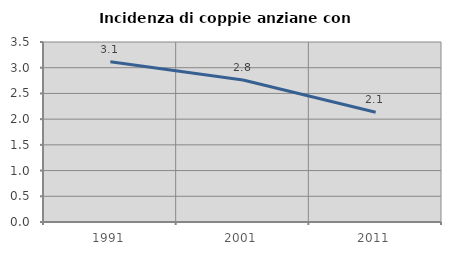
| Category | Incidenza di coppie anziane con figli |
|---|---|
| 1991.0 | 3.116 |
| 2001.0 | 2.762 |
| 2011.0 | 2.133 |